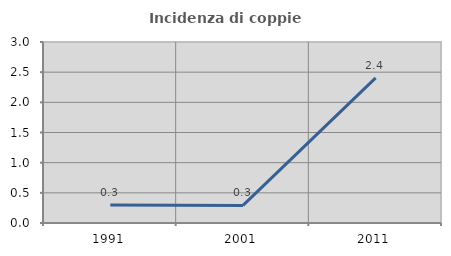
| Category | Incidenza di coppie miste |
|---|---|
| 1991.0 | 0.299 |
| 2001.0 | 0.292 |
| 2011.0 | 2.406 |